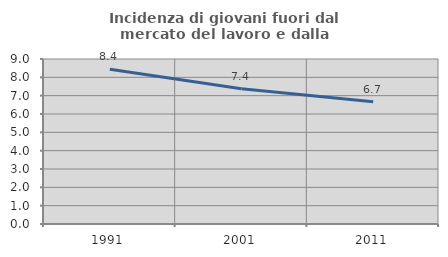
| Category | Incidenza di giovani fuori dal mercato del lavoro e dalla formazione  |
|---|---|
| 1991.0 | 8.445 |
| 2001.0 | 7.38 |
| 2011.0 | 6.667 |